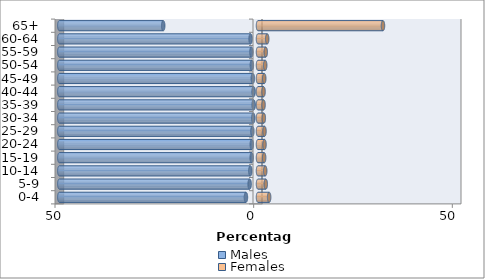
| Category | Males | Females |
|---|---|---|
| 0-4 | -3.036 | 2.803 |
| 5-9 | -2.101 | 1.957 |
| 10-14 | -1.931 | 1.82 |
| 15-19 | -1.582 | 1.545 |
| 20-24 | -1.56 | 1.636 |
| 25-29 | -1.421 | 1.635 |
| 30-34 | -1.179 | 1.465 |
| 35-39 | -1.087 | 1.394 |
| 40-44 | -1.108 | 1.399 |
| 45-49 | -1.3 | 1.571 |
| 50-54 | -1.55 | 1.812 |
| 55-59 | -1.658 | 1.95 |
| 60-64 | -1.867 | 2.32 |
| 65+ | -23.856 | 31.456 |